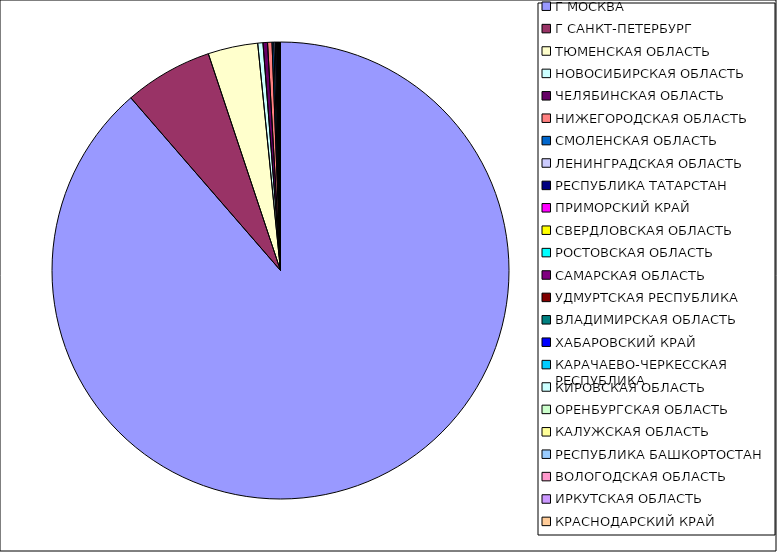
| Category | Оборот |
|---|---|
| Г МОСКВА | 0.886 |
| Г САНКТ-ПЕТЕРБУРГ | 0.062 |
| ТЮМЕНСКАЯ ОБЛАСТЬ | 0.035 |
| НОВОСИБИРСКАЯ ОБЛАСТЬ | 0.004 |
| ЧЕЛЯБИНСКАЯ ОБЛАСТЬ | 0.003 |
| НИЖЕГОРОДСКАЯ ОБЛАСТЬ | 0.003 |
| СМОЛЕНСКАЯ ОБЛАСТЬ | 0.001 |
| ЛЕНИНГРАДСКАЯ ОБЛАСТЬ | 0.001 |
| РЕСПУБЛИКА ТАТАРСТАН | 0.001 |
| ПРИМОРСКИЙ КРАЙ | 0 |
| СВЕРДЛОВСКАЯ ОБЛАСТЬ | 0 |
| РОСТОВСКАЯ ОБЛАСТЬ | 0 |
| САМАРСКАЯ ОБЛАСТЬ | 0 |
| УДМУРТСКАЯ РЕСПУБЛИКА | 0 |
| ВЛАДИМИРСКАЯ ОБЛАСТЬ | 0 |
| ХАБАРОВСКИЙ КРАЙ | 0 |
| КАРАЧАЕВО-ЧЕРКЕССКАЯ РЕСПУБЛИКА | 0 |
| КИРОВСКАЯ ОБЛАСТЬ | 0 |
| ОРЕНБУРГСКАЯ ОБЛАСТЬ | 0 |
| КАЛУЖСКАЯ ОБЛАСТЬ | 0 |
| РЕСПУБЛИКА БАШКОРТОСТАН | 0 |
| ВОЛОГОДСКАЯ ОБЛАСТЬ | 0 |
| ИРКУТСКАЯ ОБЛАСТЬ | 0 |
| КРАСНОДАРСКИЙ КРАЙ | 0 |
| САРАТОВСКАЯ ОБЛАСТЬ | 0 |
| СТАВРОПОЛЬСКИЙ КРАЙ | 0 |
| ТАМБОВСКАЯ ОБЛАСТЬ | 0 |
| РЯЗАНСКАЯ ОБЛАСТЬ | 0 |
| РЕСПУБЛИКА ДАГЕСТАН | 0 |